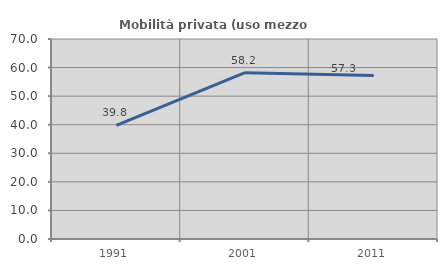
| Category | Mobilità privata (uso mezzo privato) |
|---|---|
| 1991.0 | 39.793 |
| 2001.0 | 58.197 |
| 2011.0 | 57.267 |